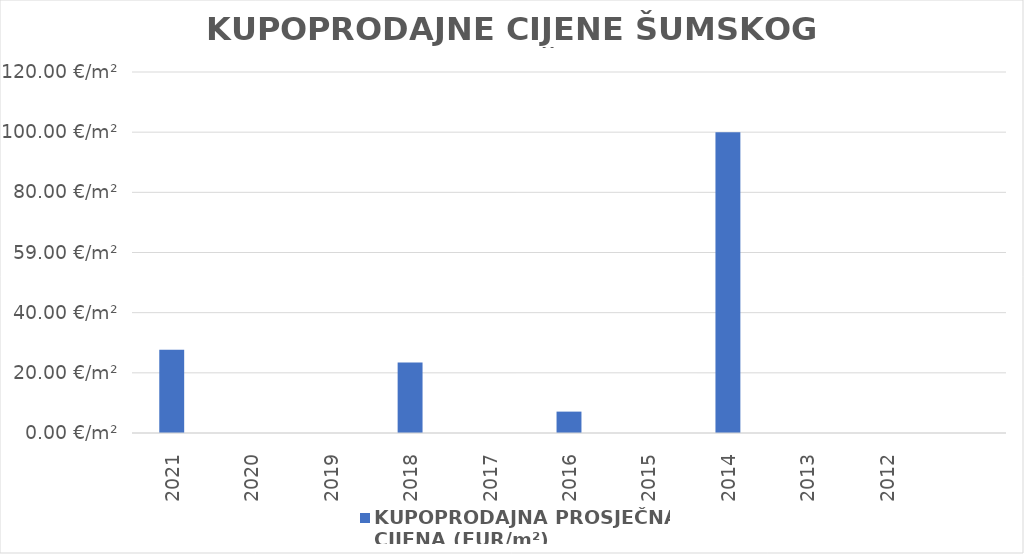
| Category | KUPOPRODAJNA PROSJEČNA 
CIJENA (EUR/m²) |
|---|---|
| 2021 | 1900-01-27 17:07:10 |
| 2020 | 0 |
| 2019 | 0 |
| 2018 | 1900-01-23 10:26:49 |
| 2017 | 0 |
| 2016 | 1900-01-07 02:37:32 |
| 2015 | 0 |
| 2014 | 1900-04-08 22:36:40 |
| 2013 | 0 |
| 2012 | 0 |